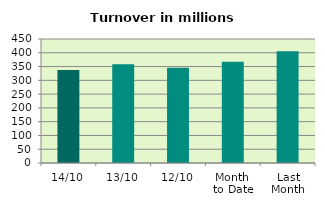
| Category | Series 0 |
|---|---|
| 14/10 | 337.649 |
| 13/10 | 358.595 |
| 12/10 | 345.365 |
| Month 
to Date | 367.503 |
| Last
Month | 405.806 |